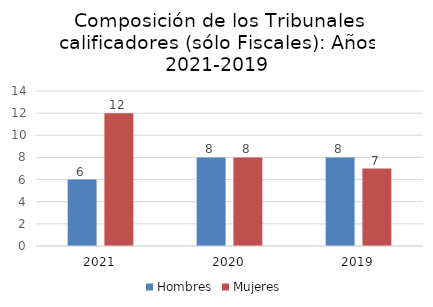
| Category | Hombres | Mujeres |
|---|---|---|
| 0 | 6 | 12 |
| 1 | 8 | 8 |
| 2 | 8 | 7 |